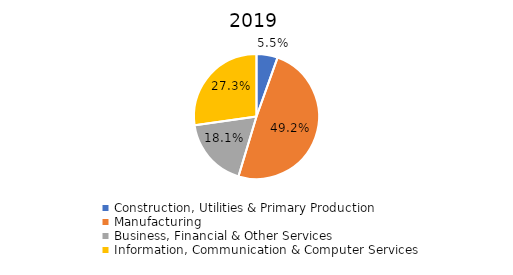
| Category | 2019 |
|---|---|
| Construction, Utilities & Primary Production  | 0.055 |
| Manufacturing  | 0.492 |
| Business, Financial & Other Services | 0.181 |
| Information, Communication & Computer Services | 0.273 |